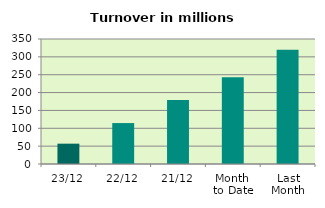
| Category | Series 0 |
|---|---|
| 23/12 | 56.924 |
| 22/12 | 114.604 |
| 21/12 | 179.193 |
| Month 
to Date | 242.731 |
| Last
Month | 319.611 |